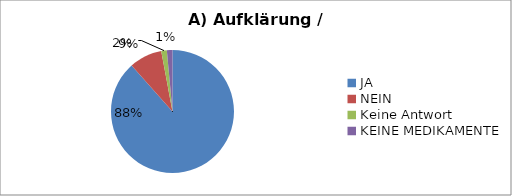
| Category | Series 0 |
|---|---|
| JA | 420 |
| NEIN | 41 |
| Keine Antwort | 7 |
| KEINE MEDIKAMENTE | 7 |